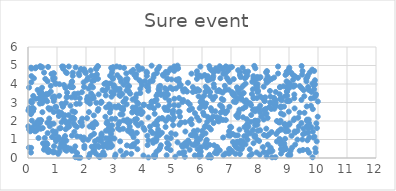
| Category | Series 0 |
|---|---|
| 6.514540313641692 | 0.25 |
| 3.258036223303853 | 2.355 |
| 9.611685176595932 | 2.788 |
| 6.718119250185469 | 2.056 |
| 3.560900860458809 | 0.226 |
| 9.434667183937016 | 4.973 |
| 9.293604395264447 | 1.469 |
| 2.3106375163464357 | 0.904 |
| 9.527382701474306 | 3.335 |
| 8.726764199824812 | 0.893 |
| 5.825327841776408 | 4.685 |
| 3.1801052760502415 | 3.356 |
| 1.8508317692140197 | 1.908 |
| 0.438417089783949 | 3.344 |
| 2.7900266712365154 | 1.78 |
| 7.911885719242525 | 3.995 |
| 5.846657293763941 | 3.717 |
| 7.2453509117797 | 2.362 |
| 2.072651007675997 | 0.986 |
| 7.290248872529956 | 2.613 |
| 3.8726823225385285 | 2.642 |
| 2.1349625093110856 | 2.94 |
| 4.938799020726297 | 1.337 |
| 1.2728139878986489 | 0.508 |
| 7.4158468451568815 | 2.201 |
| 0.012625506129645414 | 1.712 |
| 9.66142939396353 | 1.606 |
| 9.600120747328019 | 4.144 |
| 4.246755495161998 | 2.842 |
| 4.922787181447119 | 1.071 |
| 4.590618096940318 | 3.41 |
| 6.416403614070068 | 3.818 |
| 5.556336335870954 | 0.84 |
| 2.8954090609565775 | 4.62 |
| 1.8686792845479105 | 2.127 |
| 0.6749942693990907 | 4.15 |
| 2.9628327406106125 | 3.931 |
| 9.04494552154286 | 0.16 |
| 4.452664086378109 | 1.772 |
| 6.681659004231962 | 3.192 |
| 5.825778668973726 | 4.275 |
| 6.379328122886779 | 3.17 |
| 0.579129729845812 | 1.083 |
| 0.6876049098019399 | 0.331 |
| 1.4634961794776968 | 3.828 |
| 3.871232251648208 | 3.512 |
| 3.8288889218697317 | 4.767 |
| 3.775248777607053 | 2.42 |
| 4.660409793697826 | 4.506 |
| 0.11693143783072735 | 4.427 |
| 4.454933465504913 | 4.768 |
| 7.1762036709917805 | 0.581 |
| 2.9810257942731 | 1.051 |
| 0.4017918721057989 | 3.498 |
| 5.003178958912086 | 1.778 |
| 7.9161145641658335 | 1.989 |
| 5.619706045245647 | 1.236 |
| 0.03004618112941615 | 0.562 |
| 8.925193801852668 | 3.833 |
| 1.5428799589430853 | 4.44 |
| 5.013668524437431 | 2.569 |
| 1.9841431051500913 | 4.631 |
| 7.758082436355092 | 1.512 |
| 2.2690806493149953 | 2.302 |
| 3.541358059265891 | 0.631 |
| 7.892898900187163 | 3.235 |
| 0.1755198143646053 | 2.539 |
| 8.896641847217783 | 0.48 |
| 3.9532553654040594 | 2.474 |
| 6.966066409401218 | 1.207 |
| 0.037444465372146185 | 1.545 |
| 6.808218139456765 | 0.241 |
| 9.623420101642365 | 2.072 |
| 4.429543796718467 | 3.363 |
| 3.052163067318224 | 3.764 |
| 8.871622594810644 | 3.341 |
| 1.9599323128183277 | 4.673 |
| 8.632051306754953 | 1.442 |
| 7.502352511373928 | 2.76 |
| 1.2376455097584937 | 3.947 |
| 6.634056661532679 | 4.312 |
| 2.5329976426552725 | 3.005 |
| 3.740877927754135 | 3.434 |
| 5.686220917137559 | 3.568 |
| 3.3809819670199937 | 2.001 |
| 9.8960376760196 | 3.979 |
| 2.9307054772341754 | 4.279 |
| 8.228029484336398 | 0.088 |
| 2.2506429488890456 | 3.339 |
| 5.685380858201006 | 3.83 |
| 2.1715633291461134 | 1.191 |
| 7.654770253525554 | 1.328 |
| 8.399872269272793 | 1.399 |
| 2.6926859489544466 | 4.063 |
| 4.041003279543859 | 4.158 |
| 1.0608959885048153 | 1.024 |
| 6.711718383214096 | 3.533 |
| 2.454232472207053 | 0.958 |
| 0.8292543904805627 | 1.134 |
| 1.3782073640301062 | 1.663 |
| 6.588337880781211 | 3.66 |
| 3.653043263124766 | 0.73 |
| 9.686106286316482 | 3.676 |
| 8.85359167712618 | 1.797 |
| 1.9267528540206402 | 1.105 |
| 0.1400782745509066 | 3.004 |
| 5.359114226030945 | 3.595 |
| 2.63489078296532 | 4.007 |
| 3.4679052299274113 | 1.873 |
| 6.1043733892131415 | 2.766 |
| 8.561822941673391 | 1.297 |
| 5.414003402297297 | 0.806 |
| 6.712299307437418 | 4.796 |
| 6.810480057490162 | 4.584 |
| 8.683702296176923 | 1.918 |
| 2.626913685242187 | 0.688 |
| 1.0752280736995579 | 3.362 |
| 8.12736722713076 | 3.852 |
| 1.4089234324547706 | 1.942 |
| 5.045221637019969 | 3.201 |
| 7.7156233174318825 | 0.215 |
| 5.240193843390656 | 2.237 |
| 9.691128857250453 | 0.289 |
| 2.6246427155748844 | 0.709 |
| 5.506216551615943 | 3.014 |
| 5.848012588612992 | 0.477 |
| 1.2111415343120546 | 4.826 |
| 4.559511935105263 | 3.897 |
| 7.036706938964193 | 3.558 |
| 7.130024140764714 | 0.681 |
| 6.943980034351408 | 2.769 |
| 8.483028087952224 | 3.253 |
| 2.9015591479718736 | 4.799 |
| 1.7673103558054337 | 4.472 |
| 7.4375483032000735 | 3.512 |
| 8.507203204080842 | 3.145 |
| 1.3291151319703531 | 0.392 |
| 2.531101460166074 | 0.89 |
| 9.290065904599496 | 0.994 |
| 8.864440213556103 | 1.036 |
| 7.967733605172224 | 2.673 |
| 7.182201013032082 | 2.29 |
| 9.659340068282848 | 3.835 |
| 1.521302968155922 | 4.136 |
| 9.848716116556968 | 1.103 |
| 5.218818625873767 | 0.256 |
| 3.6867273387000665 | 2.078 |
| 1.4646692164385788 | 2.824 |
| 7.465627525975101 | 1.674 |
| 0.8776639442550549 | 4.222 |
| 2.129740435931937 | 0.217 |
| 8.998576381001227 | 4.791 |
| 4.867270504674572 | 3.106 |
| 2.983964614326701 | 2.781 |
| 7.093316455840945 | 4.264 |
| 6.3464652420747765 | 2.548 |
| 9.202016896984315 | 4.42 |
| 6.895471794531911 | 4.239 |
| 6.264222998689867 | 0.707 |
| 1.2012748553761154 | 2.825 |
| 4.82044853488968 | 4.284 |
| 1.8028459880965542 | 0.014 |
| 7.85060531830029 | 4.259 |
| 4.3543954767927655 | 3.08 |
| 7.063594628770513 | 1.299 |
| 0.8881672881791536 | 4.571 |
| 0.6330445116990024 | 3.399 |
| 4.147813707292426 | 3.636 |
| 2.4776869820574277 | 0.047 |
| 5.806915966917377 | 0.843 |
| 9.823055023263779 | 1.429 |
| 8.936965084795968 | 4.582 |
| 4.380535839575199 | 0.068 |
| 0.9544879582097587 | 1.424 |
| 7.914297933571 | 3.554 |
| 6.212698852102766 | 0.043 |
| 4.236206944368406 | 1.456 |
| 3.188035578879046 | 2.36 |
| 1.5042275510615666 | 4.103 |
| 0.45368998309875397 | 2.036 |
| 7.968309888299755 | 0.92 |
| 0.48629664329291833 | 4.913 |
| 4.551455021510849 | 0.545 |
| 1.0871277109977606 | 1.604 |
| 5.93566228334256 | 0.555 |
| 3.6305060942906775 | 0.738 |
| 7.5685874340832395 | 0.99 |
| 8.282125300683639 | 0.318 |
| 5.080129334359851 | 0.069 |
| 8.22695800207018 | 4.066 |
| 4.32745277895061 | 4.357 |
| 5.1900322604879765 | 2.839 |
| 9.183193680717087 | 3.431 |
| 5.044480115368461 | 2.855 |
| 2.8992486127065775 | 1.509 |
| 1.5979403462377006 | 0.397 |
| 3.4015113763620084 | 4.113 |
| 2.4110813390291916 | 4.949 |
| 7.030300307435878 | 4.919 |
| 5.776724905912203 | 1.266 |
| 4.680318558717148 | 4.443 |
| 0.9331551276336136 | 1.315 |
| 1.0430371045711961 | 0.225 |
| 3.8637399333534272 | 2.529 |
| 3.6200438204071617 | 2.524 |
| 6.163536174882916 | 0.979 |
| 0.7144950208958001 | 0.436 |
| 9.625427176227253 | 4.348 |
| 6.41934125486266 | 4.649 |
| 0.10373397440362142 | 2.643 |
| 5.485324604742309 | 3.588 |
| 0.03992719842108916 | 2.7 |
| 6.823739761555845 | 4.953 |
| 6.719900862978956 | 2.555 |
| 6.399390012197944 | 1.888 |
| 2.356510678143986 | 2.981 |
| 4.41154532265295 | 0.905 |
| 6.391364944535076 | 4.423 |
| 5.955075213295808 | 0.116 |
| 9.02473897776195 | 0.224 |
| 1.2224174323990267 | 4.936 |
| 8.137386755633694 | 2.599 |
| 5.9567739569855895 | 0.341 |
| 3.1718929641161377 | 4.317 |
| 1.7838015784739347 | 2.937 |
| 6.270906933123551 | 4.242 |
| 5.845889803515922 | 1.494 |
| 8.241404398006035 | 1.191 |
| 9.95508216872793 | 0.897 |
| 1.4997986400469954 | 3.277 |
| 7.095664108203753 | 3.046 |
| 3.4290357937433837 | 4.269 |
| 2.6688865298084496 | 2.229 |
| 6.543294061614979 | 0.499 |
| 4.7025456202294835 | 2.718 |
| 5.301733448824302 | 0.682 |
| 7.247550160782171 | 4.747 |
| 7.545310348943461 | 2.097 |
| 7.307451780532784 | 0.218 |
| 7.332142571232993 | 4.371 |
| 1.4947215984230477 | 2.129 |
| 6.143240497960162 | 2.944 |
| 0.8967386409265554 | 0.636 |
| 2.4368344431937086 | 3.439 |
| 7.664707222498533 | 2.956 |
| 0.26424618904399844 | 3.202 |
| 6.74054164617933 | 0.146 |
| 2.0352448726717585 | 3.181 |
| 3.71327616995225 | 2.745 |
| 2.2020913739788126 | 4.457 |
| 9.663890006803909 | 1.373 |
| 6.459865381903898 | 2.526 |
| 3.762144668001416 | 0.885 |
| 3.996319309304331 | 2.882 |
| 8.711038210874376 | 2.017 |
| 3.017206831126984 | 0.191 |
| 9.486145207419945 | 1.288 |
| 4.367661746456171 | 2.389 |
| 3.0806639127640323 | 4.476 |
| 4.798404682042131 | 0.538 |
| 7.860147931615403 | 1.915 |
| 6.3816719039158905 | 2.241 |
| 4.877253682173817 | 2.851 |
| 2.33862078462149 | 0.24 |
| 3.724900766705128 | 2.085 |
| 6.2735918978225405 | 4.832 |
| 5.910648101177124 | 0.074 |
| 9.93043456170236 | 3.444 |
| 4.481147686210333 | 4.812 |
| 9.820999612242465 | 2.643 |
| 5.830470793768743 | 2.202 |
| 1.347682203159476 | 3.314 |
| 1.2040110168763807 | 2.769 |
| 0.037801893082247684 | 3.809 |
| 7.15447996717555 | 0.226 |
| 5.159745400582453 | 4.833 |
| 2.6915173147839666 | 1.474 |
| 0.10468571588818865 | 2.401 |
| 8.34470673158056 | 3.625 |
| 6.94182275503053 | 0.347 |
| 4.821484832978177 | 3.435 |
| 5.523232727882823 | 0.945 |
| 9.893856861453509 | 4.202 |
| 5.208489437091116 | 3.242 |
| 1.2806991897897213 | 0.448 |
| 8.224242214543965 | 4.657 |
| 8.64163376453481 | 1.934 |
| 6.038383613097386 | 2.453 |
| 7.7927000005170335 | 4.23 |
| 1.150259706234692 | 0.75 |
| 0.4424430270645563 | 1.582 |
| 4.302377585368769 | 1.344 |
| 6.631966731170321 | 3.592 |
| 9.679259066702755 | 2.075 |
| 2.043555373403103 | 3.049 |
| 3.7229447155647954 | 1.885 |
| 8.367000429181433 | 0.56 |
| 5.3321003032338705 | 0.599 |
| 0.24783488352909 | 1.445 |
| 7.332485757335206 | 0.931 |
| 5.7188539551587105 | 1.453 |
| 6.474273480099159 | 4.844 |
| 0.20645592904206866 | 1.482 |
| 3.48420569018135 | 3.891 |
| 0.706216778228479 | 2.698 |
| 5.750110339120952 | 0.692 |
| 6.976334313948312 | 0.454 |
| 7.371194537192962 | 3.439 |
| 4.098172594941047 | 4.437 |
| 8.852529477733437 | 1.84 |
| 3.410123841095598 | 0.68 |
| 6.954289928328272 | 4.111 |
| 0.8673044424426257 | 4.319 |
| 7.855765397749956 | 4.257 |
| 5.643888866368334 | 1.824 |
| 9.990744768019354 | 2.231 |
| 1.5128956668273696 | 1.208 |
| 3.93388917086809 | 3.95 |
| 1.0648475623602605 | 2.268 |
| 5.921630233792862 | 2.695 |
| 2.1725198348733743 | 3.909 |
| 1.3423772247763188 | 1.867 |
| 4.484015765399862 | 2.846 |
| 0.8503494217069896 | 3.272 |
| 7.776164515706685 | 0.798 |
| 9.19151780647466 | 1.434 |
| 0.7528963879212025 | 1.717 |
| 4.801627071903875 | 0.823 |
| 9.848113686434678 | 3.927 |
| 9.632829366969023 | 0.435 |
| 9.193343354852173 | 2.681 |
| 4.545725821500337 | 1.291 |
| 9.36594439407828 | 2.445 |
| 5.266191773828888 | 3.949 |
| 7.838992140334514 | 1.197 |
| 0.22752325299455478 | 1.796 |
| 9.61789981577809 | 2.019 |
| 8.261439886375273 | 4.416 |
| 7.802275845440008 | 4.978 |
| 8.810940513478846 | 2.344 |
| 0.37096325404107455 | 3.207 |
| 0.19751498215501373 | 2.659 |
| 5.8448672464615115 | 1.037 |
| 3.6238560780121643 | 0.637 |
| 8.83875381340874 | 0.773 |
| 4.911861901838694 | 3.816 |
| 3.4019592583251033 | 2.901 |
| 5.1930736472680685 | 2.48 |
| 1.5321927376089672 | 3.838 |
| 8.003325289158044 | 2.466 |
| 3.550955562387773 | 4.66 |
| 5.222423120304373 | 3.892 |
| 4.3803315809945715 | 3.074 |
| 1.644026634879986 | 4.902 |
| 2.8749578887028546 | 3.563 |
| 9.00954510703923 | 1.805 |
| 2.2815319103560796 | 4.198 |
| 1.8589885743263257 | 3.555 |
| 7.478890724353494 | 3.027 |
| 5.197220392025122 | 4.268 |
| 7.882079933877385 | 0.3 |
| 4.785195511697403 | 1.115 |
| 8.229990341659354 | 4.204 |
| 9.481755710453035 | 0.436 |
| 0.2520906812216084 | 4.85 |
| 4.155163877615523 | 0.947 |
| 5.985117269969175 | 2.812 |
| 0.9730232198145583 | 2.751 |
| 2.4045716868712583 | 2.555 |
| 5.794371801498438 | 3.613 |
| 0.10436051829027182 | 4.882 |
| 5.100461762520299 | 4.887 |
| 5.517294853772071 | 4.066 |
| 8.62337746160611 | 4.568 |
| 1.9191750382633344 | 4.091 |
| 9.993747789134206 | 3.054 |
| 4.451363117371424 | 1.339 |
| 1.8653586643806797 | 1.746 |
| 3.3976129104142636 | 3.649 |
| 1.597530083334503 | 1.411 |
| 2.9247422389931224 | 1.069 |
| 3.8044481382731243 | 2.935 |
| 1.8185593622325391 | 4.781 |
| 2.8454326378790995 | 2.635 |
| 0.6691587948883027 | 0.742 |
| 6.391924342224485 | 4.656 |
| 4.843147185309907 | 2.152 |
| 9.213663530744414 | 0.725 |
| 8.888515432361721 | 1.73 |
| 3.389295265588336 | 4.572 |
| 6.098486295088654 | 1.674 |
| 5.276805542338191 | 1.919 |
| 8.992293380357658 | 2.507 |
| 5.750902091777567 | 0.141 |
| 2.8216141431772956 | 2.875 |
| 6.0017367785585085 | 1.211 |
| 1.9355872706732824 | 4.798 |
| 1.5137523090646887 | 0.39 |
| 9.942339834454698 | 1.875 |
| 7.417022082745534 | 2.674 |
| 7.772842904376491 | 4.423 |
| 3.612112896544982 | 2.728 |
| 9.916404290672297 | 3.361 |
| 6.526206393716296 | 3.604 |
| 9.429583205640709 | 1.889 |
| 6.11024455491199 | 0.742 |
| 7.400770034237737 | 0.905 |
| 8.216943695766492 | 4.238 |
| 2.7965680801615314 | 2.801 |
| 9.428145298580276 | 3.14 |
| 1.6296604356593025 | 3.265 |
| 7.292869346962921 | 1.535 |
| 1.0953288674330153 | 0.547 |
| 2.426164801467212 | 2.653 |
| 4.524273077650355 | 2.13 |
| 6.120912075072845 | 1.736 |
| 9.18136628560243 | 3.23 |
| 2.532538135257576 | 1.252 |
| 3.625433430757715 | 4.758 |
| 6.251216382244198 | 4.964 |
| 9.159375376729873 | 2.045 |
| 1.3043759149534695 | 2.988 |
| 7.92225473007978 | 2.654 |
| 4.94739304736599 | 4.246 |
| 5.883000750286059 | 3.33 |
| 3.1061163061557693 | 1.6 |
| 0.5076090670040445 | 1.617 |
| 7.934239028134008 | 3.626 |
| 8.724029758113156 | 0.478 |
| 6.038238049857735 | 2.973 |
| 1.088255380925739 | 0.349 |
| 2.2647002554373366 | 3.225 |
| 4.719760991873817 | 3.772 |
| 4.144153920804195 | 3.798 |
| 2.6332343460393837 | 0.161 |
| 1.6178097755352572 | 2.485 |
| 2.198064178238086 | 0.611 |
| 2.246388612894501 | 0.353 |
| 4.526143397310761 | 1.238 |
| 7.370068755906996 | 3.161 |
| 7.5634819412285434 | 4.465 |
| 8.134913644347938 | 0.323 |
| 3.7513531518291154 | 1.356 |
| 7.153047281873003 | 1.221 |
| 2.438404582255579 | 0.086 |
| 5.102520807874495 | 3.76 |
| 8.676149734853674 | 1.033 |
| 9.160756959725987 | 3.895 |
| 7.77511674733937 | 3.234 |
| 7.3126028949046775 | 0.784 |
| 0.7861361268459366 | 3.895 |
| 4.265516784529528 | 3.038 |
| 6.093954121144587 | 4.486 |
| 4.020414590051057 | 1.524 |
| 7.421340141562386 | 3.903 |
| 1.2327160071735843 | 2.079 |
| 9.867915486132105 | 4.707 |
| 8.737187801379068 | 3.246 |
| 4.780560604598476 | 0.147 |
| 8.710846180635837 | 1.547 |
| 9.867204301409426 | 3.718 |
| 9.919052296363692 | 0.313 |
| 8.8899861854347 | 1.441 |
| 3.288723180164299 | 3.035 |
| 3.666606055257511 | 4.491 |
| 7.839313199469372 | 4.851 |
| 2.93432063017197 | 4.91 |
| 7.554513202457955 | 1.828 |
| 4.802460769707334 | 4.257 |
| 6.1501400984532815 | 0.573 |
| 0.485121948191366 | 2.963 |
| 3.9092159141230445 | 1.876 |
| 6.643729626311099 | 2.45 |
| 9.108035441854273 | 0.559 |
| 1.6648785804134192 | 2.923 |
| 2.3770568078292764 | 4.515 |
| 1.9337343234559734 | 3.842 |
| 5.637234837005489 | 4.559 |
| 4.115149888418496 | 1.202 |
| 3.904265513414157 | 2.375 |
| 1.3040326091506271 | 4.645 |
| 7.927140550005194 | 1.471 |
| 1.6882461532318405 | 1.172 |
| 0.2842434893649681 | 4.898 |
| 3.1774048513833764 | 0.899 |
| 5.680638407100113 | 1.216 |
| 8.007058358184846 | 1.497 |
| 2.821650081287367 | 1.575 |
| 9.013965941736261 | 3.796 |
| 3.1570100757823827 | 3.605 |
| 1.9860133615502618 | 4.597 |
| 3.440544034466264 | 1.473 |
| 8.127271047730495 | 2.081 |
| 7.050854723961548 | 3.464 |
| 2.4452055976173384 | 0.598 |
| 1.80982614476338 | 1.953 |
| 1.687693211754655 | 1.682 |
| 2.5954215763514465 | 0.313 |
| 4.297942774185888 | 4.167 |
| 7.257058687233062 | 3.198 |
| 3.310387544310418 | 4.872 |
| 9.154460827792217 | 3.856 |
| 6.1275117351814155 | 3.851 |
| 7.916547724499319 | 2.017 |
| 8.15694660148163 | 3.096 |
| 1.054581208178751 | 1.054 |
| 3.898384417023535 | 4.122 |
| 1.0443380125020718 | 2.498 |
| 2.4125312702599166 | 4.282 |
| 5.3915856327208855 | 0.311 |
| 8.17915523314131 | 3.281 |
| 8.357384106579417 | 3.321 |
| 0.7409180008273886 | 2.624 |
| 7.47637359773273 | 4.313 |
| 5.1747036016131425 | 4.851 |
| 1.5458908453414388 | 3.835 |
| 1.1731598931019493 | 2.352 |
| 2.597298058036296 | 0.611 |
| 6.17298411321083 | 3.688 |
| 8.827103444167498 | 2.78 |
| 7.676310559929539 | 1.952 |
| 7.046942656077171 | 0.349 |
| 2.824344023949755 | 2.46 |
| 2.8469644382830674 | 4.031 |
| 8.878514706045483 | 4.487 |
| 0.1590611467898173 | 2.716 |
| 7.691048578308904 | 2.857 |
| 3.7862936001086824 | 4.954 |
| 8.983642249820438 | 3.938 |
| 0.10209388492896987 | 0.295 |
| 0.6396430935566699 | 0.807 |
| 9.78054165765431 | 3.567 |
| 5.944020921533207 | 4.938 |
| 2.6822679117858215 | 1.065 |
| 1.545275444741031 | 2.196 |
| 8.622986786106614 | 4.945 |
| 7.80406731158709 | 1.223 |
| 4.4335068783290845 | 3.145 |
| 7.069715247301182 | 0.86 |
| 4.897193608231383 | 4.761 |
| 1.3716063337318107 | 0.551 |
| 2.896559774070766 | 1.769 |
| 9.77281777683055 | 1.666 |
| 3.159660315821534 | 3.733 |
| 1.2015805747819408 | 0.821 |
| 0.7251526458453283 | 0.34 |
| 3.278483962989942 | 1.583 |
| 1.2916317110415798 | 3.784 |
| 7.104886741576245 | 3.361 |
| 3.599689196227027 | 1.27 |
| 8.936970624167206 | 3.363 |
| 2.516317137283044 | 0.14 |
| 8.754617009828978 | 3.125 |
| 9.962423243946368 | 1.62 |
| 0.9150561573413984 | 4.314 |
| 0.450916950475867 | 3.529 |
| 5.1964486822132905 | 4.126 |
| 0.3660232664841556 | 2.043 |
| 6.942456178845146 | 4.901 |
| 0.7319029357844131 | 2.133 |
| 3.9798703453791417 | 0.133 |
| 0.9660386035829827 | 0.912 |
| 7.502330038892256 | 4.02 |
| 8.308420594798077 | 1.276 |
| 3.5079063406498134 | 1.693 |
| 9.018772905660684 | 1.867 |
| 3.1619149634159083 | 1.534 |
| 6.312114971423158 | 2.098 |
| 3.280406114727522 | 2.72 |
| 4.262322608121282 | 4.99 |
| 8.725150761304116 | 2.404 |
| 8.53397491995067 | 0.042 |
| 2.682491367872487 | 0.724 |
| 6.1808956522292835 | 1.954 |
| 5.322760270980663 | 3.021 |
| 1.3301853856727464 | 3.265 |
| 3.1165925537688413 | 1.824 |
| 2.8795101916864496 | 3.314 |
| 0.6375478645652155 | 3.462 |
| 1.2250107634709406 | 1.02 |
| 8.041386333667749 | 2.237 |
| 3.390713415885104 | 0.26 |
| 7.734720839643412 | 4.122 |
| 8.418015731024349 | 0.036 |
| 0.9444060699835222 | 1.311 |
| 2.899280795165212 | 0.66 |
| 9.507949694965683 | 3.662 |
| 7.8114216232541365 | 1.146 |
| 0.07728719617782431 | 1.442 |
| 4.130878318828178 | 3.954 |
| 0.3377885483614085 | 1.692 |
| 1.3217792532368233 | 0.935 |
| 9.467254834272186 | 4.704 |
| 1.5700974003174328 | 1.881 |
| 1.3397422266720849 | 4.593 |
| 8.21763571661273 | 1.584 |
| 0.3034071194535637 | 1.917 |
| 6.071367193300111 | 3.361 |
| 0.4367604539535752 | 2.047 |
| 2.6557295704571473 | 3.618 |
| 7.36543237538327 | 0.77 |
| 4.219156771503924 | 4.152 |
| 2.0328600713587344 | 4.221 |
| 0.44925858112296435 | 4.896 |
| 6.278818826990794 | 3.565 |
| 8.511790731888624 | 2.802 |
| 6.736240565278764 | 3.136 |
| 6.735387349953658 | 4.549 |
| 4.51985820162582 | 0.457 |
| 3.424918445262052 | 2.076 |
| 6.4043073011317215 | 3.984 |
| 6.808718535505652 | 2.415 |
| 2.7787263030198806 | 4.014 |
| 0.3618052777354497 | 1.079 |
| 2.525984394438272 | 3.041 |
| 1.4618874641865498 | 0.508 |
| 3.155100237645688 | 1.945 |
| 5.99228549044994 | 3.095 |
| 4.265277050702652 | 3.048 |
| 4.343702950169841 | 2.675 |
| 2.162245494876094 | 4.733 |
| 8.525450982408344 | 2.874 |
| 8.486445952752407 | 4.346 |
| 4.431500383402095 | 1.134 |
| 0.111541768122837 | 3.097 |
| 8.01707889082486 | 4.371 |
| 2.179531682866387 | 3.186 |
| 4.767148171856536 | 3.356 |
| 6.178848330868765 | 4.381 |
| 7.261568749988988 | 2.459 |
| 5.950805441243966 | 3.028 |
| 7.243076325835797 | 3.654 |
| 0.10731978554506916 | 0.549 |
| 8.202732257817912 | 2.659 |
| 8.55145859633141 | 2.805 |
| 3.0119091686193444 | 2.123 |
| 6.934930476555819 | 0.488 |
| 6.3758467350532255 | 4.291 |
| 0.957207890132894 | 4.027 |
| 8.690155317892431 | 3.179 |
| 1.2776679312092043 | 1.185 |
| 1.4415504357176212 | 3.89 |
| 9.341803686933774 | 1.705 |
| 6.327221264605183 | 4.742 |
| 4.735293749918039 | 3.266 |
| 6.18573621642872 | 4.278 |
| 1.300738761889989 | 1.554 |
| 3.1724612848244096 | 4.908 |
| 6.564780814035361 | 4.705 |
| 1.533420480718829 | 2.528 |
| 6.198824408056293 | 3.74 |
| 1.748813204264138 | 4.58 |
| 8.91764020253578 | 4.658 |
| 0.6928629484155224 | 4.922 |
| 0.32352374818800156 | 1.596 |
| 6.548526706327655 | 2.014 |
| 0.13421571903722507 | 2.02 |
| 8.929047591337905 | 3.069 |
| 5.575463459810678 | 0.443 |
| 7.829388738337762 | 1.772 |
| 8.540047899363742 | 2.964 |
| 2.916073549571665 | 4.338 |
| 0.553466967547257 | 4.616 |
| 3.1925574937417633 | 0.392 |
| 0.4967291173868582 | 2.476 |
| 8.268944004948876 | 0.726 |
| 6.498592351282191 | 2.209 |
| 5.991132148282608 | 3.067 |
| 9.453069308739746 | 4.507 |
| 6.6049024597498915 | 2.167 |
| 9.054321635756459 | 0.392 |
| 9.37422311068177 | 3.884 |
| 3.874195991975612 | 3.743 |
| 8.391982187075701 | 4.268 |
| 3.7721865942335486 | 0.475 |
| 7.206517659598356 | 0.873 |
| 7.722467345942833 | 3.455 |
| 1.6291896748399315 | 0.627 |
| 8.716609583351305 | 0.732 |
| 0.5889943474936787 | 0.6 |
| 4.984037351971432 | 2.49 |
| 9.566306289297874 | 1.35 |
| 3.0473616074413066 | 2.731 |
| 1.421198278883652 | 1.711 |
| 8.1560547864761 | 2.37 |
| 6.145620844729197 | 0.904 |
| 8.161477494597392 | 3.075 |
| 5.65538656128239 | 2.663 |
| 7.856128505160251 | 3.979 |
| 9.907310824536097 | 0.522 |
| 2.7474046613377556 | 0.569 |
| 2.3139897024277833 | 4.45 |
| 5.352932503288192 | 3.133 |
| 4.382705970198187 | 0.108 |
| 0.014448518924103926 | 2.567 |
| 4.854622555248947 | 0.718 |
| 8.972024956205399 | 0.157 |
| 8.426601193057254 | 0.382 |
| 4.152606426072101 | 0.032 |
| 5.08919164055384 | 1.278 |
| 2.2166363081580345 | 1.834 |
| 5.981941813902054 | 0.585 |
| 8.583877053711856 | 0.893 |
| 0.8879406177188309 | 2.484 |
| 4.629437243666574 | 2.158 |
| 5.5701004166210675 | 1.99 |
| 1.1521040712186592 | 0.626 |
| 0.9507673430062202 | 4.01 |
| 6.954050867884462 | 0.45 |
| 4.916935700312957 | 0.424 |
| 2.791933279849909 | 1.626 |
| 6.310187191917924 | 0.022 |
| 3.7242999268256325 | 2.593 |
| 4.432493904740429 | 1.003 |
| 6.5862507471596645 | 3.654 |
| 2.682032332932125 | 3.38 |
| 2.2118801456091095 | 4.163 |
| 8.355829781408842 | 0.337 |
| 3.490596876050099 | 1.504 |
| 0.2997007268227403 | 1.495 |
| 2.3565842520341196 | 1.838 |
| 8.362298746677912 | 0.494 |
| 0.8547532980838979 | 0.348 |
| 9.856878002590083 | 3.248 |
| 0.5519415893125423 | 0.45 |
| 2.798879299975381 | 2.895 |
| 1.5453917527172567 | 4.613 |
| 4.316987425429458 | 0.82 |
| 4.5222257413122335 | 3.859 |
| 5.120980375537943 | 4.928 |
| 9.635232141225178 | 0.956 |
| 5.6681402858199625 | 0.72 |
| 9.310776378835946 | 4.334 |
| 8.007651824855671 | 2.828 |
| 2.5087956601759043 | 0.984 |
| 4.451884937829274 | 2.01 |
| 8.212556786803724 | 4.623 |
| 8.4957472356412 | 2.662 |
| 0.4206733497971171 | 4.964 |
| 6.730064695917775 | 4.843 |
| 0.5173395852282447 | 0.792 |
| 3.5332530279836094 | 1.373 |
| 0.6674175753596601 | 1.908 |
| 7.482054279019778 | 4.657 |
| 1.5986610569970583 | 3.47 |
| 6.805585638891754 | 3.673 |
| 0.9056422128050312 | 3.328 |
| 8.971786866779706 | 1.457 |
| 3.7471096197852463 | 2.472 |
| 5.426669146513717 | 1.431 |
| 0.9107332189600692 | 3.231 |
| 1.0554145066547993 | 1.123 |
| 8.689434993447826 | 3.824 |
| 9.647979130115157 | 4.451 |
| 0.2037744402452102 | 4.31 |
| 4.993731806904248 | 2.404 |
| 3.992464528655264 | 2.859 |
| 3.7138738597857435 | 3.264 |
| 5.155767942085862 | 0.846 |
| 3.2970919464632176 | 2.035 |
| 9.757473290920668 | 3.219 |
| 9.025430459828357 | 3.095 |
| 1.347539975241756 | 3.534 |
| 6.611982034902782 | 4.959 |
| 6.703507251027297 | 2.738 |
| 9.801805853495985 | 4.779 |
| 2.539954810775619 | 1.323 |
| 2.886425311817946 | 2.113 |
| 2.763769228719469 | 1.474 |
| 3.363502354343395 | 4.24 |
| 1.149476084775215 | 0.792 |
| 7.409211108043317 | 0.84 |
| 9.316080187847259 | 2.176 |
| 7.825470359145808 | 2.632 |
| 4.526796405723865 | 4.926 |
| 5.992535690234776 | 3.217 |
| 5.628213608739475 | 2.09 |
| 9.43812578433253 | 3.776 |
| 7.110942404438107 | 3.469 |
| 9.460386383146911 | 1.001 |
| 8.093899203369666 | 3.229 |
| 7.307884530657962 | 4.481 |
| 6.008752859683733 | 3.058 |
| 6.304075214794757 | 2.694 |
| 1.275418203248686 | 2.309 |
| 2.9571158395085053 | 3.833 |
| 1.722922663406674 | 3.484 |
| 2.7096874639026147 | 1.882 |
| 2.5106777496971677 | 2.98 |
| 6.305208568145187 | 1.54 |
| 0.1812544037183894 | 3.352 |
| 1.9043262823922336 | 0.971 |
| 8.809108959346824 | 3.875 |
| 4.534386854120016 | 3.669 |
| 1.7352625713551695 | 0.016 |
| 2.832579024604195 | 4.446 |
| 7.384075762877592 | 0.565 |
| 7.5440612208092395 | 1.463 |
| 0.550006000320501 | 3.398 |
| 2.2766549061683983 | 1.307 |
| 0.41296875415764434 | 1.89 |
| 3.9266435470146765 | 2.445 |
| 1.82564145194976 | 4.811 |
| 2.239182651190198 | 3.819 |
| 2.354863350643599 | 4.798 |
| 5.90593877439038 | 0.205 |
| 3.9840106893037808 | 1.63 |
| 4.755740248500459 | 4.652 |
| 6.578545559934898 | 1.977 |
| 7.526983737440637 | 1.19 |
| 8.930865210466147 | 3.587 |
| 7.235334532417696 | 1.221 |
| 8.678908879466702 | 3.447 |
| 6.854963820833926 | 4.34 |
| 3.730164497814372 | 4.528 |
| 6.821398582878574 | 2.052 |
| 9.010966805417613 | 4.884 |
| 2.413224197658721 | 0.659 |
| 0.8087646718161534 | 4.543 |
| 6.518481788467549 | 0.601 |
| 2.178524372851883 | 3.489 |
| 1.9434185305331686 | 0.543 |
| 5.112630283270848 | 4.229 |
| 4.740304534691921 | 2.6 |
| 5.901355650361872 | 2.032 |
| 7.978100891473888 | 4.319 |
| 8.925068816136516 | 3.606 |
| 7.6014916662208885 | 1.688 |
| 4.4301853612399515 | 0.342 |
| 1.6931506262485307 | 0.266 |
| 0.09886730664444121 | 2.375 |
| 3.6067425224726812 | 3.166 |
| 5.9048551816374975 | 3.645 |
| 1.813259330198076 | 1.144 |
| 2.9998759171928704 | 0.078 |
| 8.102485629932588 | 0.588 |
| 6.866196187750302 | 2.533 |
| 8.263303047134977 | 2.164 |
| 5.2178777149435955 | 1.801 |
| 7.306205770342452 | 4.635 |
| 9.369467939242384 | 0.397 |
| 5.566739247624523 | 2.592 |
| 3.4428559077516816 | 3.834 |
| 4.3562609945544075 | 0.056 |
| 0.5145812905301539 | 3.133 |
| 7.908423105962035 | 0.975 |
| 7.8279489619899065 | 2.525 |
| 4.171545167354653 | 2.783 |
| 3.5233351669387734 | 3.477 |
| 6.787249138970413 | 3.9 |
| 6.416400922083481 | 0.688 |
| 5.988149949427404 | 4.401 |
| 4.985903497021886 | 2.064 |
| 8.317199547751132 | 2.74 |
| 3.3203624595187167 | 3.072 |
| 9.026728064756632 | 4.02 |
| 9.69587240965707 | 1.883 |
| 3.530413841500246 | 1.982 |
| 3.285963612064201 | 0.113 |
| 4.470298021881993 | 3.471 |
| 2.348998393321031 | 4.852 |
| 6.070524220935924 | 2.327 |
| 2.5339378145882216 | 1.172 |
| 4.097275927646608 | 3.865 |
| 9.876933753105213 | 1.158 |
| 0.8543727532962475 | 1.454 |
| 7.594642581652237 | 2.98 |
| 5.4099405432121035 | 3.717 |
| 9.0912453097083 | 1.2 |
| 5.7568038356696905 | 2.422 |
| 7.908691088395924 | 4.382 |
| 5.577688473287723 | 2.899 |
| 0.6601882728449093 | 3.064 |
| 6.23908781487997 | 1.659 |
| 2.807060847088273 | 0.884 |
| 5.918528238082249 | 4.46 |
| 3.752522359769457 | 2.103 |
| 6.892557455211177 | 4.712 |
| 4.984629806248154 | 3.725 |
| 8.715170640554511 | 2.791 |
| 7.697061259399973 | 2.321 |
| 9.757542769323228 | 2.82 |
| 4.212792719690942 | 2.737 |
| 2.8641099073772125 | 1.307 |
| 0.8841267543890741 | 1.855 |
| 9.498798517983829 | 1.588 |
| 5.230409659853432 | 2.499 |
| 3.250426505684809 | 3.456 |
| 7.781129565788846 | 3.25 |
| 6.202336412742663 | 4.202 |
| 7.0061929337511355 | 1.663 |
| 8.855496114229508 | 0.602 |
| 7.251817185441817 | 0.496 |
| 1.4064054464593168 | 4.945 |
| 0.8798434340309547 | 4.576 |
| 0.3336909688363565 | 3.68 |
| 6.613120021191577 | 0.41 |
| 6.624876226588032 | 2.856 |
| 2.2833735061565843 | 0.582 |
| 6.974149451263376 | 1.684 |
| 2.6936680733734084 | 2.739 |
| 3.7276231609087507 | 4.349 |
| 4.658533541938573 | 4.478 |
| 7.192554731129794 | 3.265 |
| 1.942798942521794 | 0.654 |
| 6.451102612706635 | 3.312 |
| 4.805470778651454 | 4.591 |
| 5.3145388542960115 | 0.268 |
| 3.592471425308056 | 2.46 |
| 6.942116033246009 | 4.825 |
| 4.502939713919551 | 3.722 |
| 8.987990915024174 | 3.078 |
| 4.209414203383829 | 1.697 |
| 0.7855161039259573 | 3.588 |
| 7.8616757828511385 | 3.787 |
| 5.467016645628233 | 0.653 |
| 7.640083742244067 | 0.101 |
| 0.10592003449217291 | 3.017 |
| 2.7383279963843465 | 1.974 |
| 4.7436074349398405 | 1.678 |
| 8.97392452464122 | 4.059 |
| 4.8416489692396745 | 2.194 |
| 7.161859691947053 | 3.021 |
| 4.441763998516332 | 4.588 |
| 4.579831549681876 | 0.687 |
| 7.366707057407444 | 0.482 |
| 9.211975039847683 | 1.373 |
| 7.510587404175048 | 4.354 |
| 5.414718233686372 | 1.933 |
| 6.502238445822393 | 0.427 |
| 8.529792491125523 | 3.12 |
| 0.11255884675720695 | 4.091 |
| 4.384633789313362 | 0.168 |
| 6.671258819637505 | 2.804 |
| 4.753856707921149 | 2.004 |
| 4.343248246434368 | 0.143 |
| 1.1403730542048673 | 2.449 |
| 4.573452389496967 | 3.48 |
| 0.9493007841653156 | 1.016 |
| 4.320674494109083 | 0.955 |
| 0.45637260055107376 | 3.57 |
| 8.916196429359783 | 4.145 |
| 1.223572674827953 | 2.291 |
| 6.204712531948823 | 3.662 |
| 0.14690217923556514 | 1.628 |
| 1.0807918973239372 | 3.988 |
| 7.237936958462145 | 2.19 |
| 1.1257511073584825 | 1.617 |
| 2.4046735905655483 | 4.965 |
| 5.0430858720785485 | 4.71 |
| 0.6218152205667515 | 0.614 |
| 0.8857436740617775 | 3.222 |
| 3.6400102654481357 | 1.129 |
| 2.102692288429042 | 0.064 |
| 1.7846870460245645 | 3.225 |
| 2.9530159174439174 | 3.462 |
| 4.350249285553579 | 1.838 |
| 6.9094694653185815 | 1.215 |
| 8.138881727852725 | 1.246 |
| 9.808150884221325 | 4.028 |
| 1.1576832086967515 | 1.926 |
| 5.788417340746248 | 3.671 |
| 4.48790948272743 | 1.534 |
| 7.774605957428664 | 4.293 |
| 6.916584290336415 | 3.691 |
| 7.352336033218874 | 3.241 |
| 8.798917499944597 | 0.416 |
| 2.7194884309518774 | 0.799 |
| 8.742341915459818 | 1.538 |
| 0.6105258256500701 | 3.147 |
| 7.2870344384331895 | 3.49 |
| 4.615609178654363 | 1.364 |
| 4.150182028655017 | 2.19 |
| 2.282304405410919 | 0.429 |
| 6.729685843083715 | 1.107 |
| 3.841307606290718 | 4.203 |
| 2.8542397718645462 | 0.588 |
| 9.716297418632053 | 4.625 |
| 4.086679232257897 | 4.668 |
| 2.088448991682993 | 3.75 |
| 2.052920862442801 | 3.302 |
| 8.904600350223044 | 1.657 |
| 1.2595909988578913 | 0.885 |
| 7.341698050148533 | 3.763 |
| 3.149530550435448 | 3.393 |
| 6.005971910252831 | 1.462 |
| 1.4035836391713907 | 2.318 |
| 6.202368495800154 | 4.423 |
| 4.769777809906842 | 2.697 |
| 3.373338220576273 | 3.207 |
| 6.281419896452535 | 3.355 |
| 0.8710888329164657 | 0.304 |
| 3.2606991497352658 | 2.615 |
| 4.348516827335817 | 4.503 |
| 6.445593412872281 | 0.275 |
| 2.2423425607632286 | 1.643 |
| 2.7425548366080776 | 3.78 |
| 3.1158099526015737 | 2.816 |
| 3.2800330150900967 | 2.606 |
| 7.990429919909171 | 0.18 |
| 4.827554619259567 | 2.592 |
| 4.1013050539556755 | 4.602 |
| 7.499387634696318 | 0.739 |
| 1.6344627818191682 | 0.045 |
| 7.586502802092165 | 4.672 |
| 7.753963235332333 | 3.716 |
| 5.40830192985534 | 0.065 |
| 2.8683401777108406 | 4.872 |
| 5.04327789635456 | 4.95 |
| 8.54264855340446 | 3.571 |
| 5.8226856303203505 | 0.902 |
| 4.620938962600403 | 2.14 |
| 8.224446461886249 | 2.403 |
| 6.12121624248671 | 1.332 |
| 9.13592806110663 | 4.485 |
| 8.23911573015165 | 4.698 |
| 2.311886065306965 | 0.66 |
| 5.343399802058888 | 3.697 |
| 1.5959696550703206 | 2.12 |
| 9.533347218242984 | 2.444 |
| 9.202242613608547 | 3.92 |
| 5.836878894460067 | 4.503 |
| 4.785935707833504 | 3.683 |
| 2.1015690879144353 | 2.482 |
| 8.690335925747913 | 3.836 |
| 2.308247841227662 | 1.939 |
| 0.42273220169716463 | 3.519 |
| 2.78770910606565 | 1.074 |
| 5.157617259397098 | 4.993 |
| 9.142177997213436 | 4.223 |
| 1.160178900451515 | 2.929 |
| 0.7855472708921962 | 2.664 |
| 3.578843217523764 | 1.435 |
| 7.9044595504369255 | 1.793 |
| 7.647047619626187 | 0.471 |
| 2.070134780605043 | 4.339 |
| 0.6764151948442854 | 1.344 |
| 3.6420202307806315 | 0.672 |
| 3.18806789567374 | 2.709 |
| 0.9466767673473042 | 2.771 |
| 8.011334580076777 | 3.329 |
| 8.58491437766272 | 1.997 |
| 1.3008274298431777 | 1.967 |
| 9.608471660083687 | 1.715 |
| 9.701612529329319 | 1.117 |
| 8.377680377124726 | 2.946 |
| 1.1776492630371527 | 4.948 |
| 9.812066455543157 | 0.039 |
| 6.260150572244062 | 0.171 |
| 8.351380930901932 | 3.002 |
| 3.207553579009643 | 4.136 |
| 3.294091604836428 | 3.959 |
| 2.0368479799299255 | 2.154 |
| 5.938091690000228 | 1.034 |
| 2.12210151712541 | 1.705 |
| 8.816041840654115 | 0.474 |
| 2.8414379468251925 | 0.8 |
| 7.524573504714175 | 3.119 |
| 9.079416943068777 | 4.602 |
| 0.7548150463641967 | 1.898 |
| 9.188624257247008 | 2.133 |
| 5.845569865171285 | 0.78 |
| 5.849844972500055 | 0.946 |
| 6.05704104366219 | 2.9 |
| 5.809824162074121 | 1.116 |
| 3.017204438209111 | 3.671 |
| 4.123248740421898 | 0.695 |
| 7.400278003784947 | 4.881 |
| 6.194948903415605 | 2.227 |
| 0.5969083905380634 | 4.277 |
| 7.835379536007334 | 2.02 |
| 7.456241300611035 | 1.18 |
| 2.57298065780227 | 3.672 |
| 0.8877262523491136 | 3.075 |
| 7.759792754540074 | 2.6 |
| 8.726499520171814 | 0.239 |
| 0.9132380891248071 | 0.321 |
| 4.701078090650993 | 3.464 |
| 9.59311271265358 | 4.285 |
| 0.7154425472163761 | 3.467 |
| 7.206141050208343 | 3.819 |
| 3.7956258141413155 | 1.762 |
| 8.301973774211943 | 4.174 |
| 0.4073106645747804 | 2.939 |
| 5.034476833290889 | 2.178 |
| 7.136670257560832 | 0.749 |
| 0.48494775002673296 | 3.798 |
| 4.911643757320855 | 4.838 |
| 3.0579211029463527 | 4.948 |
| 7.906897603261658 | 3.829 |
| 2.911595343103466 | 4.821 |
| 6.208439921601614 | 4.228 |
| 3.4781006030451933 | 3.601 |
| 1.6265174817812833 | 1.758 |
| 6.119073962100002 | 3.571 |
| 2.4148752589715574 | 1.01 |
| 3.7422727196336893 | 3.045 |
| 6.933010709684101 | 1.44 |
| 6.9313314519690845 | 0.238 |
| 4.794961431129144 | 3.422 |
| 0.120111481816505 | 4.834 |
| 3.934059243324395 | 4.829 |
| 1.2623768887605469 | 0.646 |
| 7.816965350151044 | 2.001 |
| 8.718868647019786 | 2.724 |
| 8.388623811614632 | 2.651 |